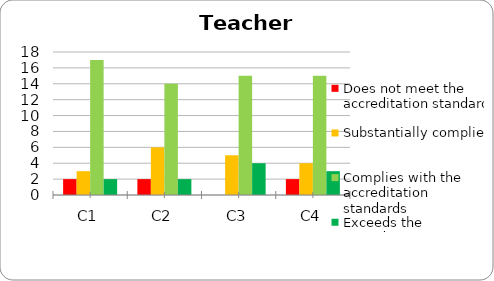
| Category | Does not meet the accreditation standard | Substantially complies | Complies with the accreditation standards | Exceeds the accreditation standards |
|---|---|---|---|---|
| C1 | 2 | 3 | 17 | 2 |
| C2 | 2 | 6 | 14 | 2 |
| C3 | 0 | 5 | 15 | 4 |
| C4 | 2 | 4 | 15 | 3 |